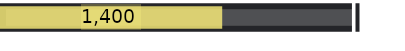
| Category | Summe von Ziel | Summe von Ist |
|---|---|---|
| Ergebnis | 2250 | 1400 |